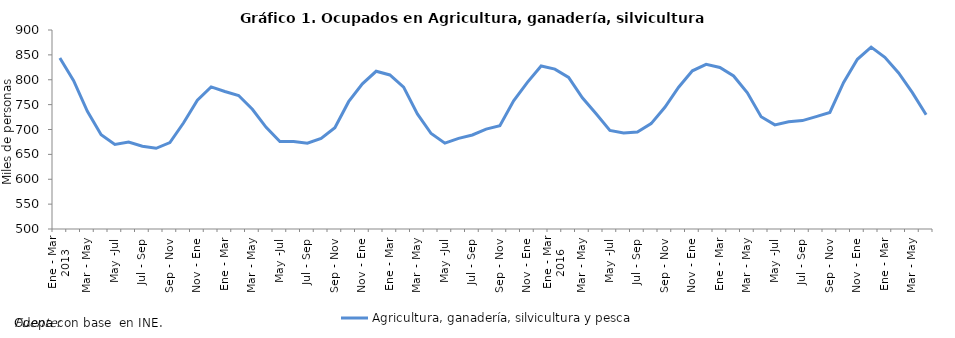
| Category | Agricultura, ganadería, silvicultura y pesca |
|---|---|
| 0 | 843.658 |
| 1 | 798.266 |
| 2 | 736.461 |
| 3 | 689.358 |
| 4 | 669.839 |
| 5 | 674.791 |
| 6 | 666.406 |
| 7 | 662.262 |
| 8 | 673.724 |
| 9 | 713.604 |
| 10 | 758.988 |
| 11 | 785.537 |
| 12 | 776.373 |
| 13 | 768.303 |
| 14 | 740.609 |
| 15 | 704.367 |
| 16 | 675.938 |
| 17 | 676.058 |
| 18 | 672.6 |
| 19 | 682.074 |
| 20 | 703.599 |
| 21 | 755.905 |
| 22 | 791.902 |
| 23 | 817.027 |
| 24 | 809.646 |
| 25 | 785.301 |
| 26 | 731.282 |
| 27 | 691.978 |
| 28 | 672.526 |
| 29 | 682.164 |
| 30 | 689.034 |
| 31 | 700.719 |
| 32 | 707.439 |
| 33 | 757.522 |
| 34 | 794.669 |
| 35 | 827.605 |
| 36 | 821.367 |
| 37 | 804.582 |
| 38 | 763.826 |
| 39 | 731.558 |
| 40 | 698.04 |
| 41 | 692.989 |
| 42 | 694.776 |
| 43 | 711.757 |
| 44 | 744.739 |
| 45 | 785.03 |
| 46 | 818.051 |
| 47 | 831.11 |
| 48 | 824.789 |
| 49 | 807.606 |
| 50 | 773.662 |
| 51 | 725.597 |
| 52 | 709.369 |
| 53 | 715.675 |
| 54 | 717.856 |
| 55 | 725.965 |
| 56 | 734.277 |
| 57 | 794.66 |
| 58 | 841.147 |
| 59 | 865.659 |
| 60 | 845.074 |
| 61 | 813.586 |
| 62 | 774.131 |
| 63 | 729.695 |